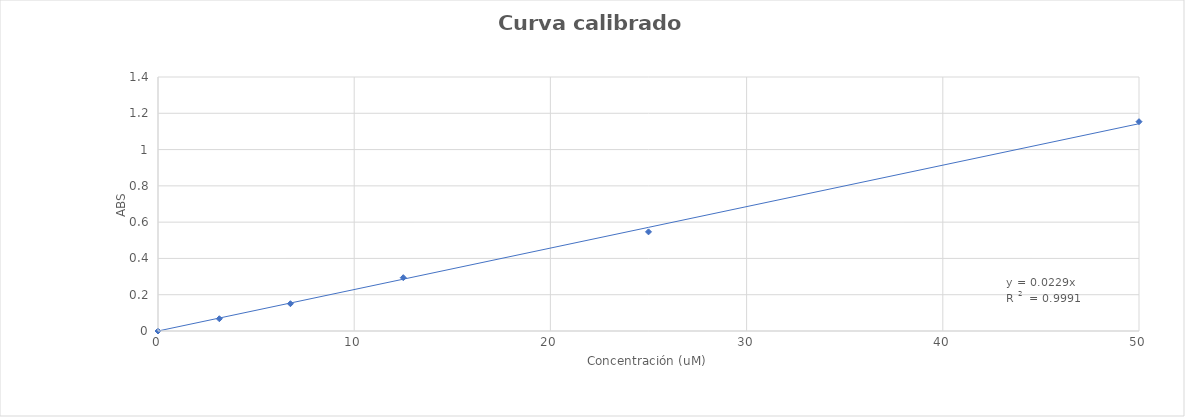
| Category | Series 0 |
|---|---|
| 50.0 | 1.154 |
| 25.0 | 0.546 |
| 12.5 | 0.294 |
| 6.75 | 0.151 |
| 3.125 | 0.068 |
| 0.0 | 0 |